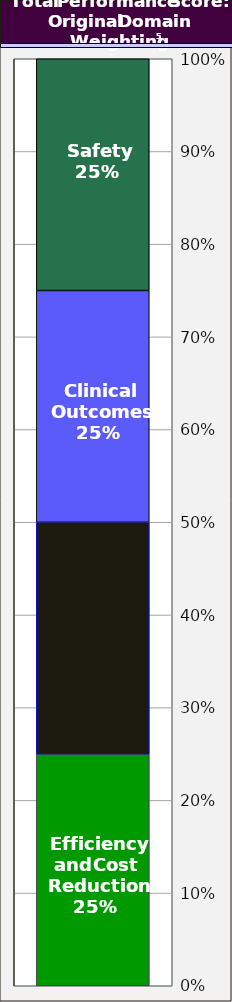
| Category | Efficiency of Care | Patient Experience of Care Domain | Clinical Care - Outcomes Domain | Safety of Care Domain |
|---|---|---|---|---|
| 0 | 0.25 | 0.25 | 0.25 | 0.25 |